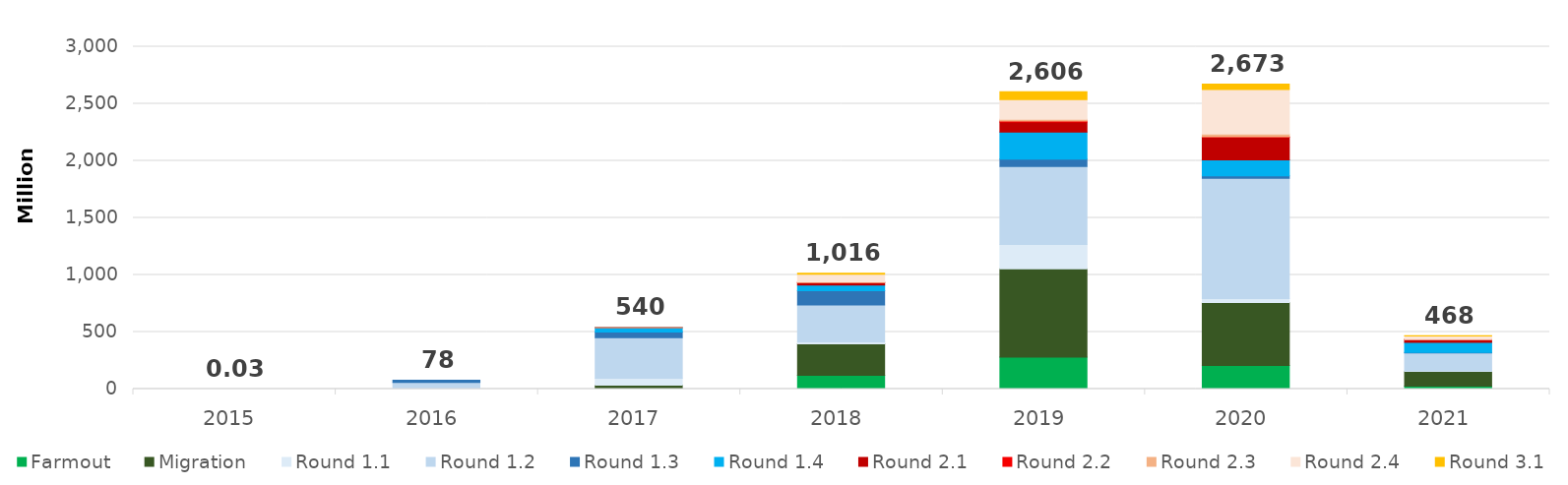
| Category | Farmout | Migration | Round 1.1 | Round 1.2 | Round 1.3 | Round 1.4 | Round 2.1 | Round 2.2 | Round 2.3 | Round 2.4 | Round 3.1 |
|---|---|---|---|---|---|---|---|---|---|---|---|
| 2015.0 | 0 | 0 | 0.023 | 0.003 | 0 | 0 | 0 | 0 | 0 | 0 | 0 |
| 2016.0 | 0 | 0 | 7.936 | 50.902 | 19.085 | 0 | 0 | 0 | 0 | 0 | 0 |
| 2017.0 | 1.551 | 32.93 | 60.276 | 356.292 | 49.062 | 38.707 | 0.93 | 0 | 0.096 | 0 | 0 |
| 2018.0 | 121.371 | 276.221 | 16.154 | 323.201 | 126.084 | 47.616 | 21.584 | 0.843 | 6.737 | 66.16 | 9.669 |
| 2019.0 | 280.617 | 772.208 | 213.486 | 685.106 | 64.244 | 235.595 | 88.72 | 9.392 | 14.554 | 173.042 | 69.349 |
| 2020.0 | 207.708 | 550.53 | 33.998 | 1054.149 | 22.253 | 140.295 | 198.226 | 3.04 | 23.879 | 391.695 | 46.857 |
| 2021.0 | 26.385 | 127.786 | 6.272 | 155.497 | 4.387 | 89.335 | 24.909 | 0.043 | 1.526 | 30.271 | 1.319 |